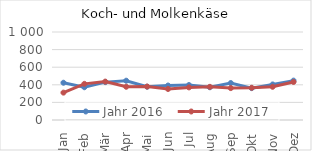
| Category | Jahr 2016 | Jahr 2017 |
|---|---|---|
| Jan | 423.448 | 311.014 |
| Feb | 372.245 | 410.855 |
| Mär | 430.408 | 436.528 |
| Apr | 446.527 | 377.796 |
| Mai | 377.877 | 380.348 |
| Jun | 391.799 | 352.571 |
| Jul | 397.241 | 370.601 |
| Aug | 372.064 | 376.803 |
| Sep | 419.845 | 362.395 |
| Okt | 362.215 | 366.052 |
| Nov | 403.922 | 377.435 |
| Dez | 447.524 | 432.112 |